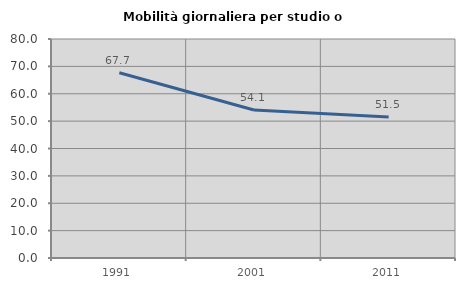
| Category | Mobilità giornaliera per studio o lavoro |
|---|---|
| 1991.0 | 67.677 |
| 2001.0 | 54.054 |
| 2011.0 | 51.538 |